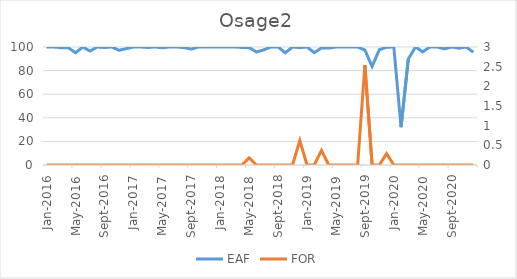
| Category | EAF |
|---|---|
| 2016-01-01 | 100 |
| 2016-02-01 | 100 |
| 2016-03-01 | 99.41 |
| 2016-04-01 | 99.39 |
| 2016-05-01 | 95.1 |
| 2016-06-01 | 100 |
| 2016-07-01 | 96.58 |
| 2016-08-01 | 100 |
| 2016-09-01 | 99.58 |
| 2016-10-01 | 100 |
| 2016-11-01 | 97.23 |
| 2016-12-01 | 98.61 |
| 2017-01-01 | 100 |
| 2017-02-01 | 100 |
| 2017-03-01 | 99.6 |
| 2017-04-01 | 100 |
| 2017-05-01 | 99.31 |
| 2017-06-01 | 100 |
| 2017-07-01 | 100 |
| 2017-08-01 | 99.46 |
| 2017-09-01 | 98.23 |
| 2017-10-01 | 100 |
| 2017-11-01 | 100 |
| 2017-12-01 | 100 |
| 2018-01-01 | 100 |
| 2018-02-01 | 100 |
| 2018-03-01 | 100 |
| 2018-04-01 | 99.58 |
| 2018-05-01 | 99.43 |
| 2018-06-01 | 95.83 |
| 2018-07-01 | 97.52 |
| 2018-08-01 | 100 |
| 2018-09-01 | 100 |
| 2018-10-01 | 95.09 |
| 2018-11-01 | 100 |
| 2018-12-01 | 99.46 |
| 2019-01-01 | 100 |
| 2019-02-01 | 95.23 |
| 2019-03-01 | 99.14 |
| 2019-04-01 | 99.08 |
| 2019-05-01 | 100 |
| 2019-06-01 | 100 |
| 2019-07-01 | 100 |
| 2019-08-01 | 100 |
| 2019-09-01 | 97.4 |
| 2019-10-01 | 83.47 |
| 2019-11-01 | 97.78 |
| 2019-12-01 | 99.73 |
| 2020-01-01 | 100 |
| 2020-02-01 | 32.04 |
| 2020-03-01 | 89.73 |
| 2020-04-01 | 100 |
| 2020-05-01 | 95.91 |
| 2020-06-01 | 100 |
| 2020-07-01 | 100 |
| 2020-08-01 | 98.41 |
| 2020-09-01 | 100 |
| 2020-10-01 | 98.95 |
| 2020-11-01 | 100 |
| 2020-12-01 | 95.63 |